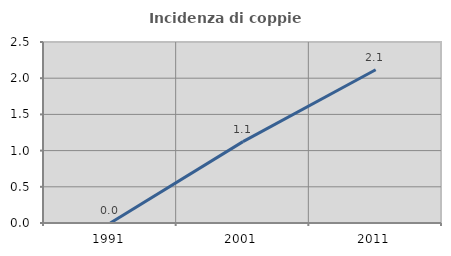
| Category | Incidenza di coppie miste |
|---|---|
| 1991.0 | 0 |
| 2001.0 | 1.124 |
| 2011.0 | 2.117 |